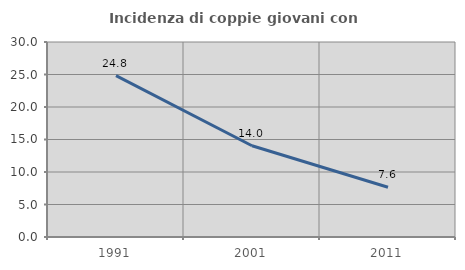
| Category | Incidenza di coppie giovani con figli |
|---|---|
| 1991.0 | 24.819 |
| 2001.0 | 14.035 |
| 2011.0 | 7.647 |